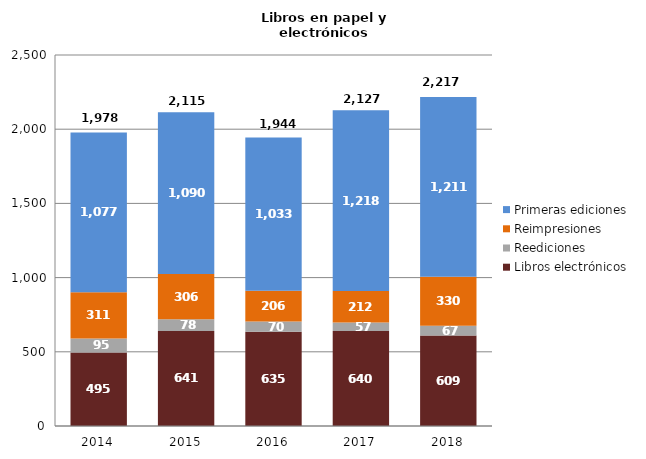
| Category | Libros electrónicos | Reediciones | Reimpresiones | Primeras ediciones |
|---|---|---|---|---|
| 2014.0 | 495 | 95 | 311 | 1077 |
| 2015.0 | 641 | 78 | 306 | 1090 |
| 2016.0 | 635 | 70 | 206 | 1033 |
| 2017.0 | 640 | 57 | 212 | 1218 |
| 2018.0 | 609 | 67 | 330 | 1211 |